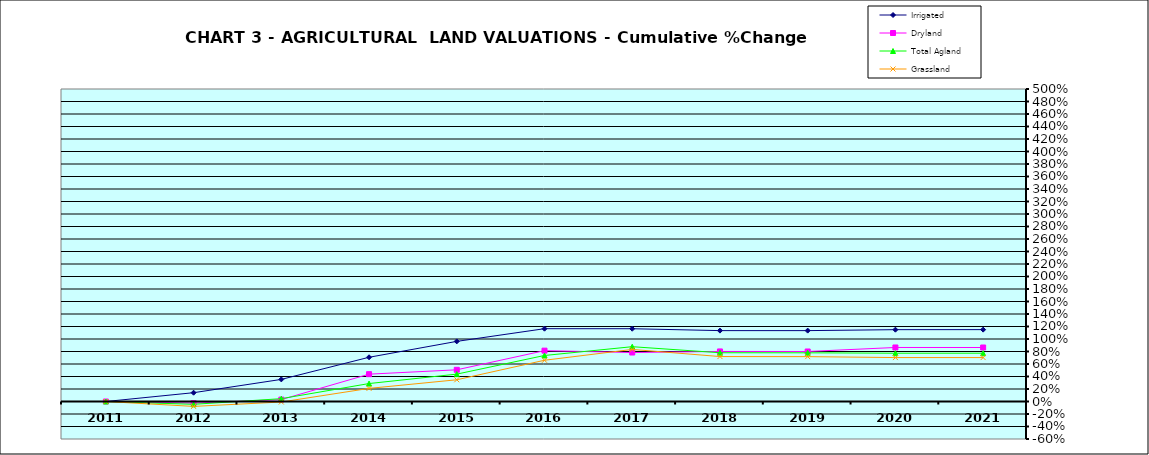
| Category | Irrigated | Dryland | Total Agland | Grassland |
|---|---|---|---|---|
| 2011.0 | 0 | 0 | 0 | 0 |
| 2012.0 | 0.141 | -0.026 | -0.045 | -0.078 |
| 2013.0 | 0.354 | 0.031 | 0.045 | -0.008 |
| 2014.0 | 0.708 | 0.437 | 0.287 | 0.21 |
| 2015.0 | 0.962 | 0.507 | 0.438 | 0.348 |
| 2016.0 | 1.165 | 0.814 | 0.736 | 0.66 |
| 2017.0 | 1.164 | 0.784 | 0.877 | 0.833 |
| 2018.0 | 1.134 | 0.801 | 0.78 | 0.719 |
| 2019.0 | 1.134 | 0.8 | 0.779 | 0.718 |
| 2020.0 | 1.149 | 0.864 | 0.772 | 0.703 |
| 2021.0 | 1.15 | 0.864 | 0.773 | 0.703 |